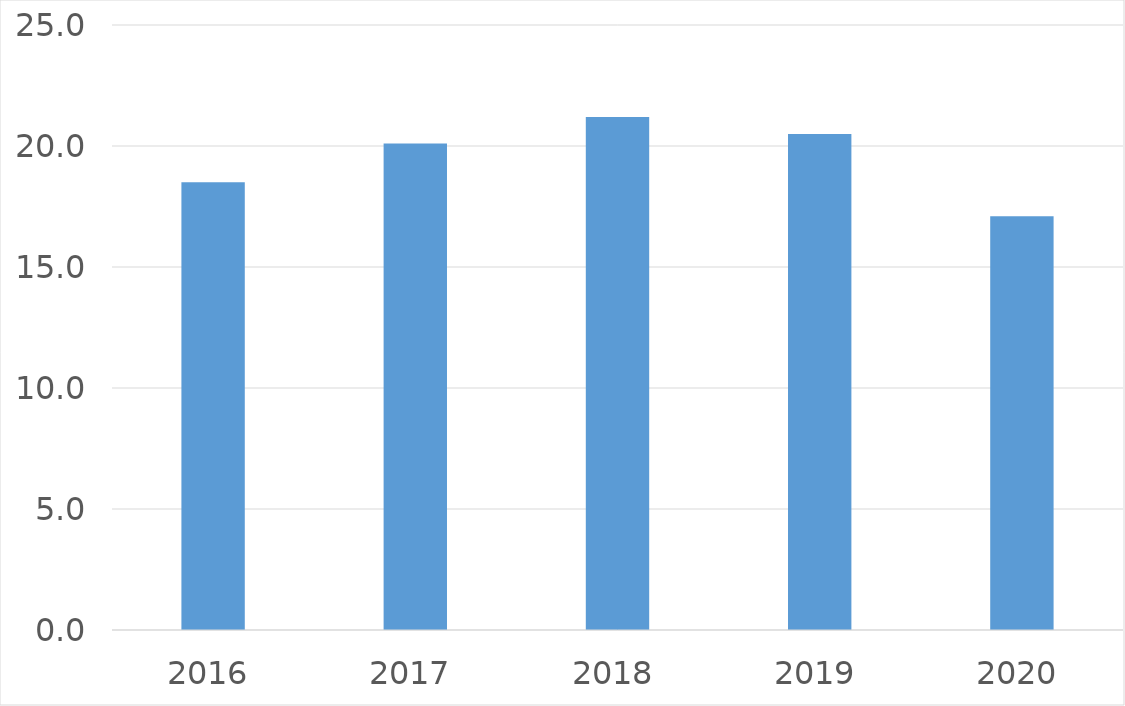
| Category | Series 0 |
|---|---|
| 2016 | 18.5 |
| 2017 | 20.1 |
| 2018 | 21.2 |
| 2019 | 20.5 |
| 2020 | 17.1 |